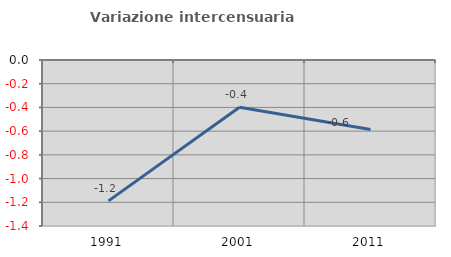
| Category | Variazione intercensuaria annua |
|---|---|
| 1991.0 | -1.188 |
| 2001.0 | -0.399 |
| 2011.0 | -0.586 |